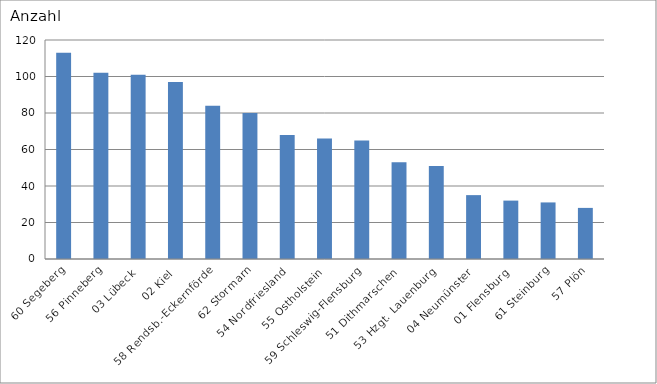
| Category | 60 Segeberg |
|---|---|
| 60 Segeberg | 113 |
| 56 Pinneberg | 102 |
| 03 Lübeck | 101 |
| 02 Kiel | 97 |
| 58 Rendsb.-Eckernförde | 84 |
| 62 Stormarn | 80 |
| 54 Nordfriesland | 68 |
| 55 Ostholstein | 66 |
| 59 Schleswig-Flensburg | 65 |
| 51 Dithmarschen | 53 |
| 53 Hzgt. Lauenburg | 51 |
| 04 Neumünster | 35 |
| 01 Flensburg | 32 |
| 61 Steinburg | 31 |
| 57 Plön | 28 |